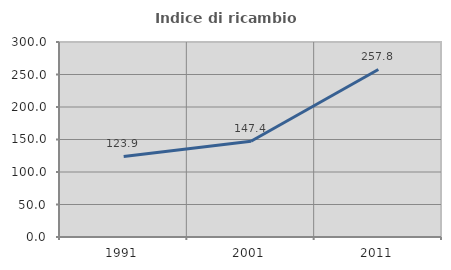
| Category | Indice di ricambio occupazionale  |
|---|---|
| 1991.0 | 123.889 |
| 2001.0 | 147.403 |
| 2011.0 | 257.759 |